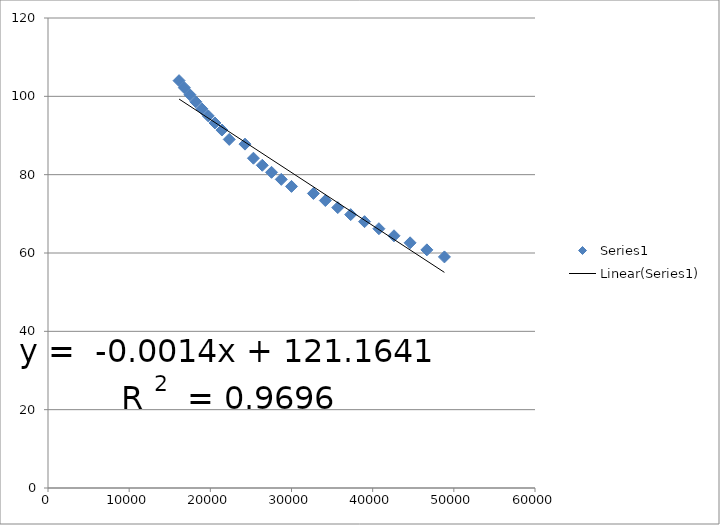
| Category | Series 0 |
|---|---|
| 48840.0 | 59 |
| 46680.0 | 60.8 |
| 44610.0 | 62.6 |
| 42630.0 | 64.4 |
| 40770.0 | 66.2 |
| 39000.0 | 68 |
| 37290.0 | 69.8 |
| 35700.0 | 71.6 |
| 34170.0 | 73.4 |
| 32700.0 | 75.2 |
| 30000.0 | 77 |
| 28740.0 | 78.8 |
| 27540.0 | 80.6 |
| 26400.0 | 82.4 |
| 25311.0 | 84.2 |
| 24270.0 | 87.8 |
| 22329.0 | 89 |
| 21429.0 | 91.4 |
| 20571.0 | 93.2 |
| 19740.0 | 95 |
| 18960.0 | 96.8 |
| 18210.0 | 98.6 |
| 17490.0 | 100.4 |
| 16800.0 | 102.2 |
| 16149.0 | 104 |